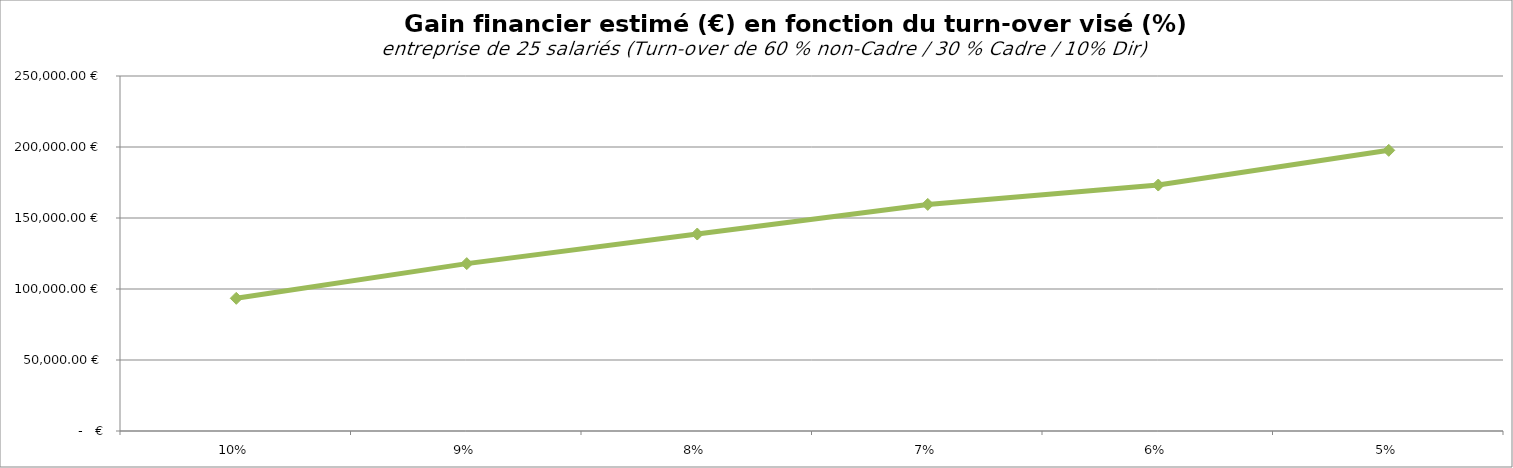
| Category | Gain financier estimé |
|---|---|
| 0.1 | 93432.81 |
| 0.09 | 117873.303 |
| 0.08 | 138719.321 |
| 0.07 | 159565.338 |
| 0.06 | 173215.479 |
| 0.05 | 197655.972 |